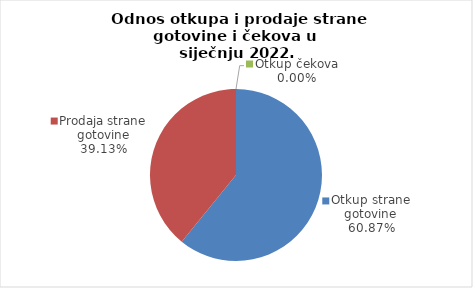
| Category | Series 0 |
|---|---|
| Otkup strane gotovine | 60.869 |
| Prodaja strane gotovine | 39.131 |
| Otkup čekova | 0 |